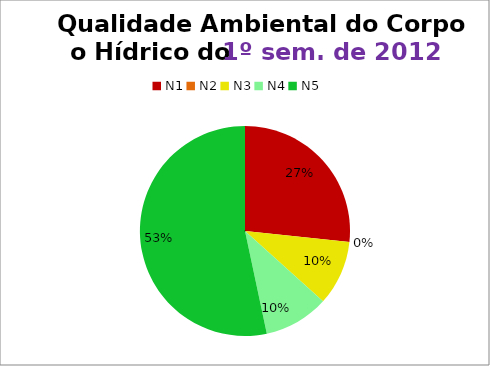
| Category | 1º/12 |
|---|---|
| N1 | 8 |
| N2 | 0 |
| N3 | 3 |
| N4 | 3 |
| N5 | 16 |